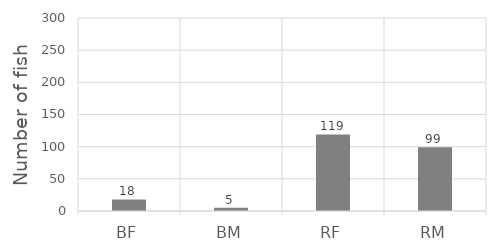
| Category | Series 0 |
|---|---|
| BF | 18 |
| BM | 5 |
| RF | 119 |
| RM | 99 |